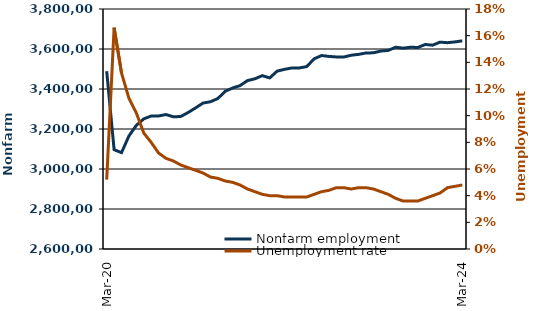
| Category |  Nonfarm employment  |
|---|---|
| 2020-03-01 | 3489000 |
| 2020-04-01 | 3096600 |
| 2020-05-01 | 3081900 |
| 2020-06-01 | 3165100 |
| 2020-07-01 | 3218400 |
| 2020-08-01 | 3250700 |
| 2020-09-01 | 3264900 |
| 2020-10-01 | 3265200 |
| 2020-11-01 | 3272300 |
| 2020-12-01 | 3261000 |
| 2021-01-01 | 3262600 |
| 2021-02-01 | 3282600 |
| 2021-03-01 | 3305600 |
| 2021-04-01 | 3329700 |
| 2021-05-01 | 3336200 |
| 2021-06-01 | 3352400 |
| 2021-07-01 | 3388800 |
| 2021-08-01 | 3404900 |
| 2021-09-01 | 3417100 |
| 2021-10-01 | 3441900 |
| 2021-11-01 | 3451000 |
| 2021-12-01 | 3466800 |
| 2022-01-01 | 3455300 |
| 2022-02-01 | 3489300 |
| 2022-03-01 | 3498300 |
| 2022-04-01 | 3505300 |
| 2022-05-01 | 3505400 |
| 2022-06-01 | 3512000 |
| 2022-07-01 | 3550900 |
| 2022-08-01 | 3567300 |
| 2022-09-01 | 3563000 |
| 2022-10-01 | 3560300 |
| 2022-11-01 | 3559800 |
| 2022-12-01 | 3568800 |
| 2023-01-01 | 3573100 |
| 2023-02-01 | 3580100 |
| 2023-03-01 | 3580900 |
| 2023-04-01 | 3589800 |
| 2023-05-01 | 3592900 |
| 2023-06-01 | 3608900 |
| 2023-07-01 | 3604200 |
| 2023-08-01 | 3608700 |
| 2023-09-01 | 3607700 |
| 2023-10-01 | 3622600 |
| 2023-11-01 | 3619100 |
| 2023-12-01 | 3634300 |
| 2024-01-01 | 3631600 |
| 2024-02-01 | 3635500 |
| 2024-03-01 | 3640800 |